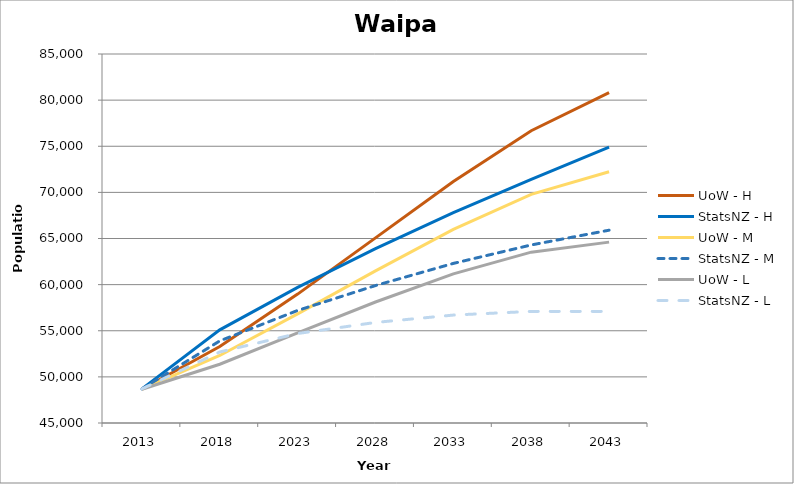
| Category | UoW - H | StatsNZ - H | UoW - M | StatsNZ - M | UoW - L | StatsNZ - L |
|---|---|---|---|---|---|---|
| 2013.0 | 48660 | 48700 | 48660 | 48700 | 48660 | 48700 |
| 2018.0 | 53286.273 | 55100 | 52317.666 | 53900 | 51367.855 | 52700 |
| 2023.0 | 58971.141 | 59700 | 56828.902 | 57200 | 54770.391 | 54700 |
| 2028.0 | 65068.605 | 63900 | 61487.966 | 59900 | 58115.543 | 55900 |
| 2033.0 | 71184.672 | 67800 | 65978.675 | 62300 | 61170.766 | 56700 |
| 2038.0 | 76682.273 | 71400 | 69780.202 | 64300 | 63521.41 | 57100 |
| 2043.0 | 80807.984 | 74900 | 72241.229 | 65900 | 64605.926 | 57100 |